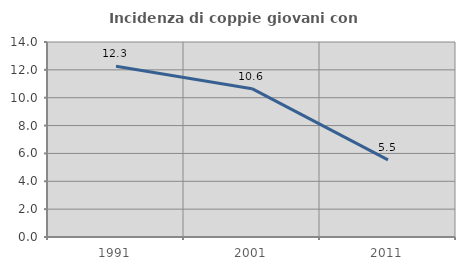
| Category | Incidenza di coppie giovani con figli |
|---|---|
| 1991.0 | 12.255 |
| 2001.0 | 10.648 |
| 2011.0 | 5.532 |